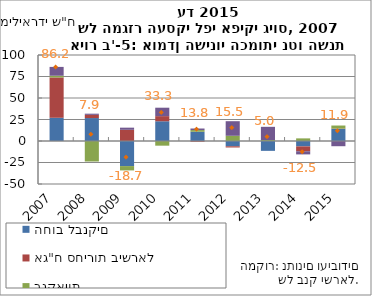
| Category | החוב לבנקים | אג"ח סחירות בישראל | אג"ח לא סחירות והלוואות חוץ בנקאיות | החוב לחו"ל |
|---|---|---|---|---|
| 2007-12-31 | 27.017 | 46.872 | 2.022 | 10.248 |
| 2008-12-31 | 26.677 | 3.716 | -23.846 | 1.371 |
| 2009-12-31 | -29.179 | 13.033 | -5.015 | 2.472 |
| 2010-12-31 | 22.948 | 5.97 | -5.439 | 9.803 |
| 2011-12-31 | 10.75 | -0.77 | 1.966 | 1.806 |
| 2012-12-31 | -6.135 | -1.409 | 6.077 | 16.944 |
| 2013-12-31 | -11.463 | 0.032 | 1.092 | 15.358 |
| 2014-12-31 | -6.253 | -5.668 | 3.049 | -3.664 |
| 2015-12-31 | 13.944 | 0.438 | 3.614 | -6.064 |